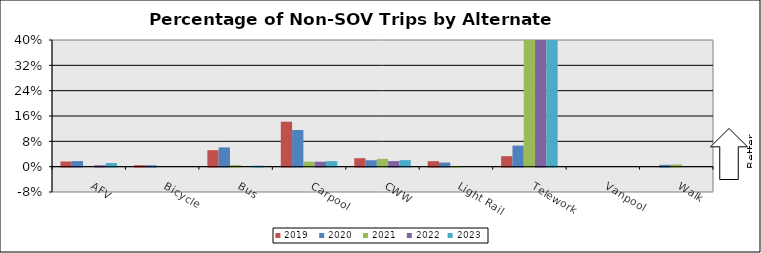
| Category | 2019 | 2020 | 2021 | 2022 | 2023 |
|---|---|---|---|---|---|
| AFV | 0.016 | 0.018 | 0 | 0.005 | 0.011 |
| Bicycle | 0.005 | 0.004 | 0 | 0 | 0 |
| Bus | 0.052 | 0.061 | 0.005 | 0 | 0.003 |
| Carpool | 0.142 | 0.116 | 0.016 | 0.016 | 0.018 |
| CWW | 0.027 | 0.02 | 0.025 | 0.018 | 0.021 |
| Light Rail | 0.017 | 0.013 | 0.002 | 0 | 0 |
| Telework | 0.033 | 0.067 | 0.819 | 0.818 | 0.814 |
| Vanpool | 0 | 0 | 0 | 0 | 0 |
| Walk | 0 | 0.006 | 0.007 | 0 | 0 |